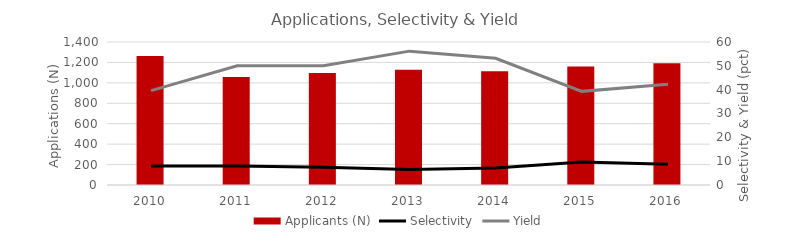
| Category | Applicants (N) |
|---|---|
| 2010.0 | 1262 |
| 2011.0 | 1057 |
| 2012.0 | 1097 |
| 2013.0 | 1129 |
| 2014.0 | 1113 |
| 2015.0 | 1160 |
| 2016.0 | 1193 |